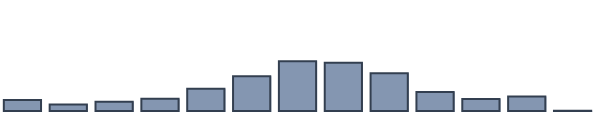
| Category | Series 0 |
|---|---|
| 0 | 3.954 |
| 1 | 2.351 |
| 2 | 3.321 |
| 3 | 4.434 |
| 4 | 8.061 |
| 5 | 12.521 |
| 6 | 17.883 |
| 7 | 17.349 |
| 8 | 13.62 |
| 9 | 6.876 |
| 10 | 4.32 |
| 11 | 5.21 |
| 12 | 0.1 |